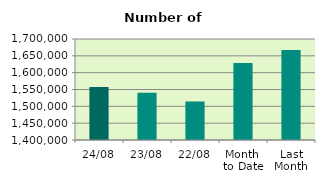
| Category | Series 0 |
|---|---|
| 24/08 | 1557750 |
| 23/08 | 1540340 |
| 22/08 | 1514464 |
| Month 
to Date | 1628893.556 |
| Last
Month | 1667155.619 |